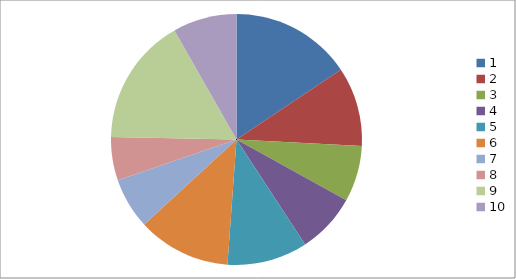
| Category | Series 0 |
|---|---|
| 0 | 23.75 |
| 1 | 15.5 |
| 2 | 11 |
| 3 | 11.75 |
| 4 | 15.75 |
| 5 | 18.25 |
| 6 | 10 |
| 7 | 8.5 |
| 8 | 25 |
| 9 | 12.5 |